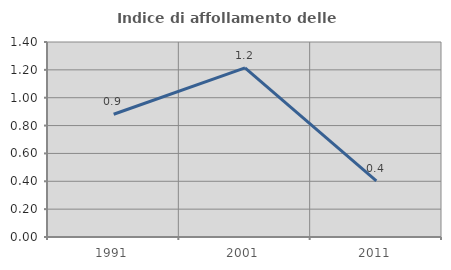
| Category | Indice di affollamento delle abitazioni  |
|---|---|
| 1991.0 | 0.881 |
| 2001.0 | 1.215 |
| 2011.0 | 0.403 |